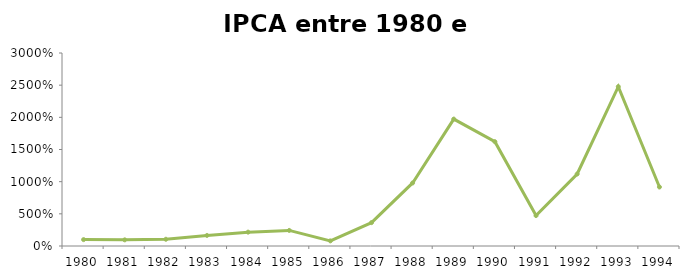
| Category | IPCA |
|---|---|
| 1980.0 | 0.992 |
| 1981.0 | 0.956 |
| 1982.0 | 1.048 |
| 1983.0 | 1.64 |
| 1984.0 | 2.153 |
| 1985.0 | 2.422 |
| 1986.0 | 0.797 |
| 1987.0 | 3.634 |
| 1988.0 | 9.802 |
| 1989.0 | 19.729 |
| 1990.0 | 16.21 |
| 1991.0 | 4.727 |
| 1992.0 | 11.191 |
| 1993.0 | 24.772 |
| 1994.0 | 9.165 |